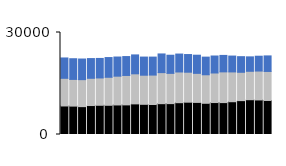
| Category | South Online | South Store | South Phone |
|---|---|---|---|
| 0 | 8393 | 8132 | 5987 |
| 1 | 8354 | 7849 | 6085 |
| 2 | 8196 | 7940 | 6065 |
| 3 | 8517 | 8013 | 5802 |
| 4 | 8596 | 8037 | 5737 |
| 5 | 8593 | 8234 | 5804 |
| 6 | 8690 | 8464 | 5633 |
| 7 | 8713 | 8651 | 5559 |
| 8 | 9008 | 8842 | 5560 |
| 9 | 8879 | 8557 | 5337 |
| 10 | 8821 | 8655 | 5291 |
| 11 | 9068 | 9131 | 5493 |
| 12 | 9084 | 8894 | 5336 |
| 13 | 9356 | 9033 | 5271 |
| 14 | 9504 | 8816 | 5199 |
| 15 | 9436 | 8546 | 5342 |
| 16 | 9182 | 8387 | 5189 |
| 17 | 9396 | 8694 | 4997 |
| 18 | 9383 | 9038 | 4838 |
| 19 | 9642 | 8765 | 4663 |
| 20 | 9962 | 8333 | 4598 |
| 21 | 10234 | 8354 | 4246 |
| 22 | 10166 | 8496 | 4363 |
| 23 | 10009 | 8536 | 4571 |